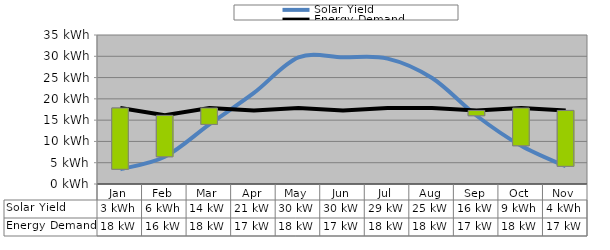
| Category | Solar Yield | Energy Demand |
|---|---|---|
| Jan | 3.46 | 17.856 |
| Feb | 6.401 | 16.128 |
| Mar | 14.006 | 17.856 |
| Apr | 21.384 | 17.28 |
| May | 29.741 | 17.856 |
| Jun | 29.754 | 17.28 |
| Jul | 29.462 | 17.856 |
| Aug | 24.887 | 17.856 |
| Sep | 16.038 | 17.28 |
| Oct | 8.984 | 17.856 |
| Nov | 4.158 | 17.28 |